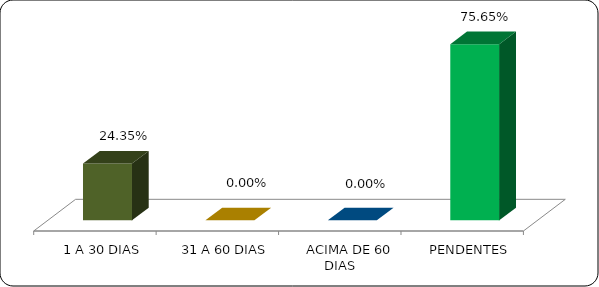
| Category | Series 0 |
|---|---|
|      1 A 30 DIAS | 0.244 |
|      31 A 60 DIAS | 0 |
|      ACIMA DE 60 DIAS | 0 |
|      PENDENTES | 0.756 |